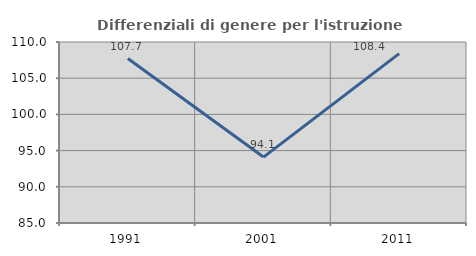
| Category | Differenziali di genere per l'istruzione superiore |
|---|---|
| 1991.0 | 107.71 |
| 2001.0 | 94.105 |
| 2011.0 | 108.399 |